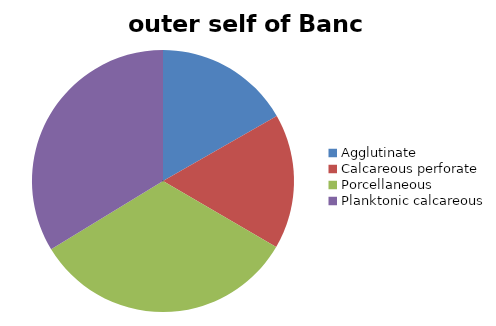
| Category | outer self of Banc d'Arguin |
|---|---|
| ﻿Agglutinate | 16.746 |
| Calcareous perforate | 16.654 |
| Porcellaneous | 32.891 |
| Planktonic calcareous | 33.708 |